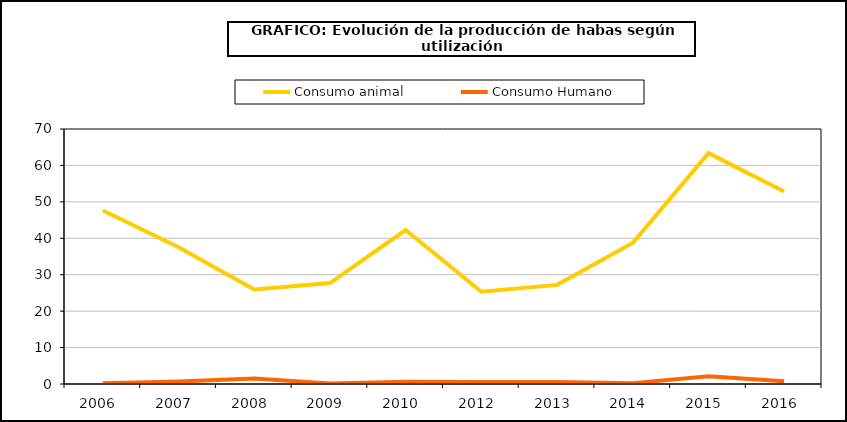
| Category | Consumo animal | Consumo Humano |
|---|---|---|
| 2006  | 47.635 | 0.209 |
| 2007  | 37.523 | 0.661 |
| 2008  | 25.955 | 1.505 |
| 2009  | 27.701 | 0.165 |
| 2010  | 42.262 | 0.62 |
| 2012  | 25.317 | 0.571 |
| 2013  | 27.212 | 0.547 |
| 2014  | 38.703 | 0.238 |
| 2015  | 63.379 | 2.153 |
| 2016  | 52.865 | 0.76 |